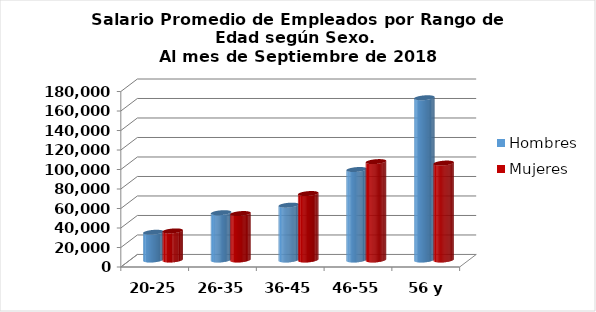
| Category | Hombres | Mujeres |
|---|---|---|
| 20-25 | 28444.5 | 29843.111 |
| 26-35 | 48518.339 | 47647.636 |
| 36-45 | 56255.133 | 68166.632 |
| 46-55 | 92816.989 | 100926.439 |
| 56 y más | 166430.62 | 99431.533 |